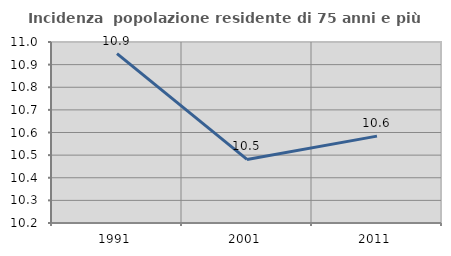
| Category | Incidenza  popolazione residente di 75 anni e più |
|---|---|
| 1991.0 | 10.949 |
| 2001.0 | 10.481 |
| 2011.0 | 10.584 |